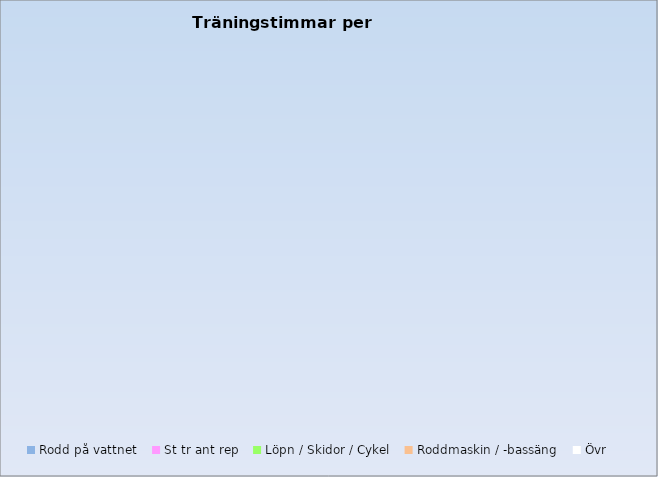
| Category | Series 0 |
|---|---|
| Rodd på vattnet | 0 |
| St tr ant rep | 0 |
| Löpn / Skidor / Cykel | 0 |
| Roddmaskin / -bassäng | 0 |
| Övr | 0 |